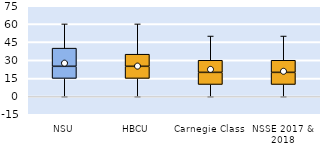
| Category | 25th | 50th | 75th |
|---|---|---|---|
| NSU | 15 | 10 | 15 |
| HBCU | 15 | 10 | 10 |
| Carnegie Class | 10 | 10 | 10 |
| NSSE 2017 & 2018 | 10 | 10 | 10 |